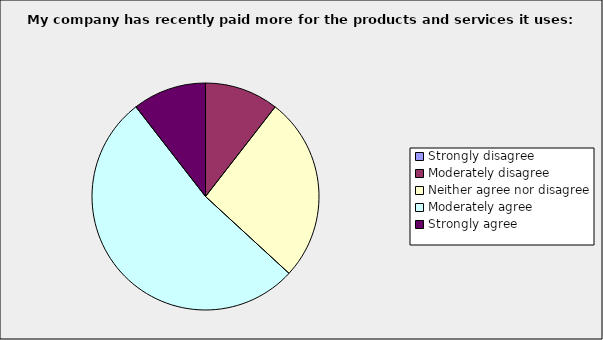
| Category | Series 0 |
|---|---|
| Strongly disagree | 0 |
| Moderately disagree | 0.105 |
| Neither agree nor disagree | 0.263 |
| Moderately agree | 0.526 |
| Strongly agree | 0.105 |